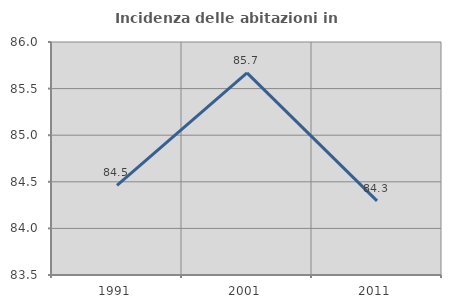
| Category | Incidenza delle abitazioni in proprietà  |
|---|---|
| 1991.0 | 84.462 |
| 2001.0 | 85.669 |
| 2011.0 | 84.295 |